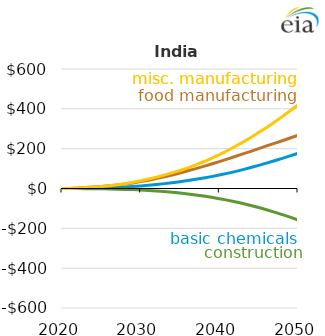
| Category | Basic chemicals | Food manufacturing | Construction | Misc. Manufacturing |
|---|---|---|---|---|
| 2020.0 | 0 | 0 | 0 | 0 |
| 2021.0 | 0.044 | 0.159 | -0.114 | 0.547 |
| 2022.0 | 0.143 | 1.955 | -0.475 | 2.885 |
| 2023.0 | 0.576 | 4.782 | -0.898 | 5.015 |
| 2024.0 | 1.359 | 7.649 | -1.149 | 7.17 |
| 2025.0 | 2.331 | 10.632 | -1.511 | 10.169 |
| 2026.0 | 3.588 | 13.94 | -2.292 | 13.86 |
| 2027.0 | 5.258 | 17.821 | -3.243 | 18.444 |
| 2028.0 | 7.4 | 22.455 | -4.4 | 24.093 |
| 2029.0 | 9.956 | 28.054 | -5.644 | 30.959 |
| 2030.0 | 12.955 | 34.562 | -7.35 | 38.826 |
| 2031.0 | 16.361 | 41.762 | -9.649 | 47.367 |
| 2032.0 | 20.195 | 49.779 | -12.212 | 56.746 |
| 2033.0 | 24.454 | 58.536 | -15.336 | 67.119 |
| 2034.0 | 29.143 | 67.995 | -18.844 | 78.393 |
| 2035.0 | 34.282 | 78.126 | -22.947 | 90.605 |
| 2036.0 | 39.877 | 88.781 | -27.397 | 103.929 |
| 2037.0 | 45.916 | 99.673 | -32.454 | 118.34 |
| 2038.0 | 52.467 | 111.141 | -37.931 | 134.282 |
| 2039.0 | 59.601 | 123.022 | -44.21 | 151.751 |
| 2040.0 | 67.362 | 135.104 | -51.037 | 170.048 |
| 2041.0 | 75.787 | 147.586 | -58.442 | 189.574 |
| 2042.0 | 84.886 | 160.449 | -66.716 | 210.712 |
| 2043.0 | 94.683 | 173.475 | -75.547 | 232.831 |
| 2044.0 | 105.061 | 186.775 | -85.252 | 255.982 |
| 2045.0 | 116.008 | 200.287 | -95.46 | 280.964 |
| 2046.0 | 127.388 | 213.625 | -106.557 | 306.553 |
| 2047.0 | 139.253 | 226.577 | -118.455 | 333.002 |
| 2048.0 | 151.387 | 239.683 | -131.22 | 360.831 |
| 2049.0 | 163.744 | 253.69 | -143.646 | 390.035 |
| 2050.0 | 176.421 | 266.764 | -157.844 | 419.746 |